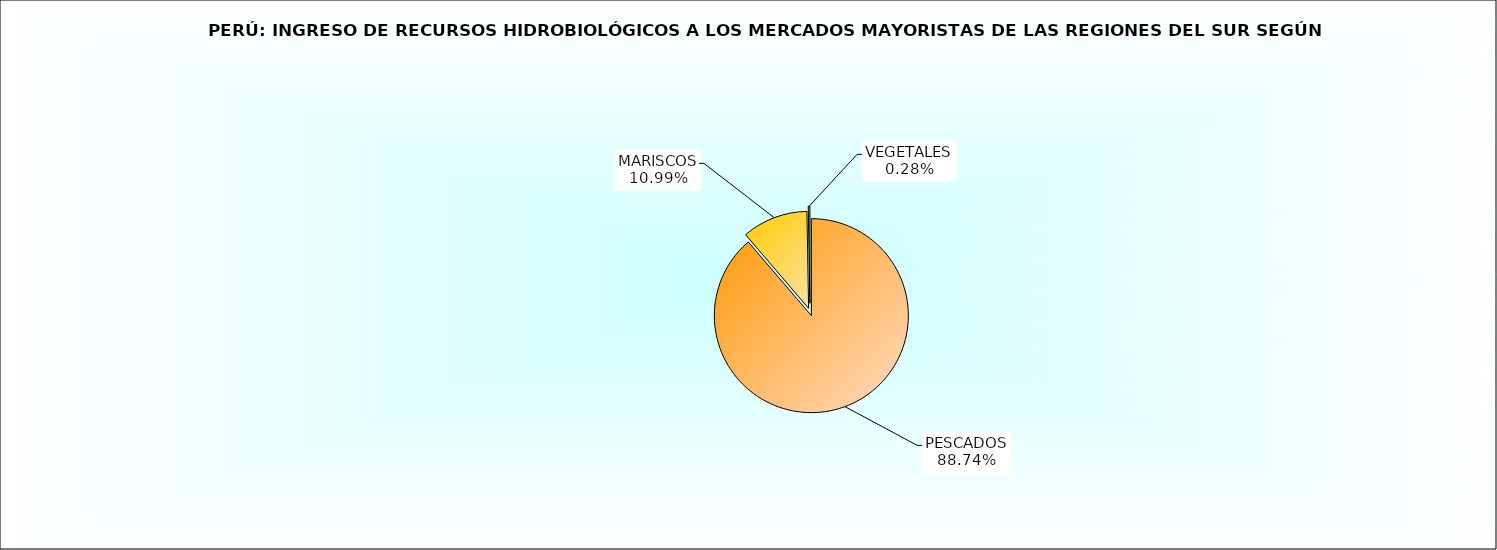
| Category | Series 0 |
|---|---|
| PESCADOS | 0.887 |
| MARISCOS | 0.11 |
| VEGETALES | 0.003 |